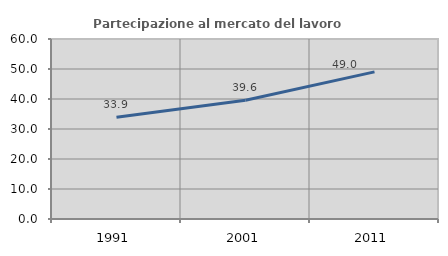
| Category | Partecipazione al mercato del lavoro  femminile |
|---|---|
| 1991.0 | 33.949 |
| 2001.0 | 39.57 |
| 2011.0 | 49.031 |